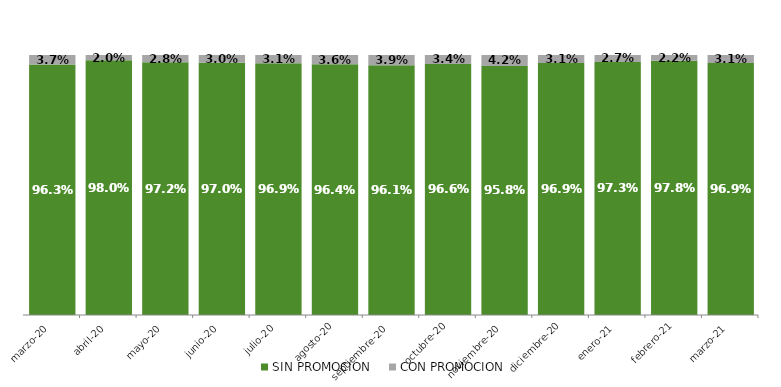
| Category | SIN PROMOCION   | CON PROMOCION   |
|---|---|---|
| 2020-03-01 | 0.963 | 0.037 |
| 2020-04-01 | 0.98 | 0.02 |
| 2020-05-01 | 0.972 | 0.028 |
| 2020-06-01 | 0.97 | 0.03 |
| 2020-07-01 | 0.969 | 0.031 |
| 2020-08-01 | 0.964 | 0.036 |
| 2020-09-01 | 0.961 | 0.039 |
| 2020-10-01 | 0.966 | 0.034 |
| 2020-11-01 | 0.958 | 0.042 |
| 2020-12-01 | 0.969 | 0.031 |
| 2021-01-01 | 0.973 | 0.027 |
| 2021-02-01 | 0.978 | 0.022 |
| 2021-03-01 | 0.969 | 0.031 |